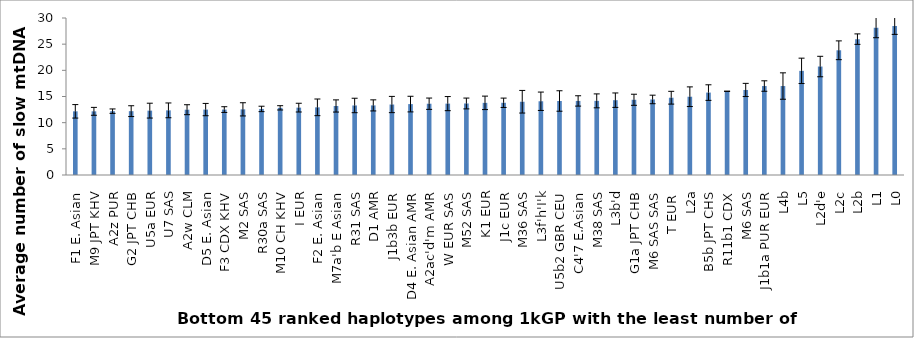
| Category | Slow average # |
|---|---|
| F1 E. Asian | 12.167 |
| M9 JPT KHV | 12.167 |
| A2z PUR | 12.2 |
| G2 JPT CHB | 12.2 |
| U5a EUR | 12.3 |
| U7 SAS | 12.353 |
| A2w CLM | 12.477 |
| D5 E. Asian | 12.5 |
| F3 CDX KHV | 12.5 |
| M2 SAS | 12.545 |
| R30a SAS | 12.625 |
| M10 CH KHV | 12.833 |
| I EUR | 12.875 |
| F2 E. Asian | 12.929 |
| M7a'b E Asian | 13.19 |
| R31 SAS | 13.286 |
| D1 AMR | 13.3 |
| J1b3b EUR | 13.467 |
| D4 E. Asian AMR | 13.551 |
| A2ac'd'm AMR | 13.621 |
| W EUR SAS | 13.64 |
| M52 SAS | 13.667 |
| K1 EUR | 13.786 |
| J1c EUR | 13.8 |
| M36 SAS | 14 |
| L3f'h'I'k | 14.091 |
| U5b2 GBR CEU | 14.143 |
| C4'7 E.Asian | 14.154 |
| M38 SAS | 14.167 |
| L3b'd | 14.296 |
| G1a JPT CHB | 14.375 |
| M6 SAS SAS | 14.438 |
| T EUR  | 14.768 |
| L2a | 14.959 |
| B5b JPT CHS | 15.75 |
| R11b1 CDX | 16 |
| M6 SAS | 16.25 |
| J1b1a PUR EUR | 17 |
| L4b | 17 |
| L5 | 19.9 |
| L2d'e | 20.727 |
| L2c | 23.833 |
| L2b | 25.962 |
| L1 | 28.138 |
| L0 | 28.457 |